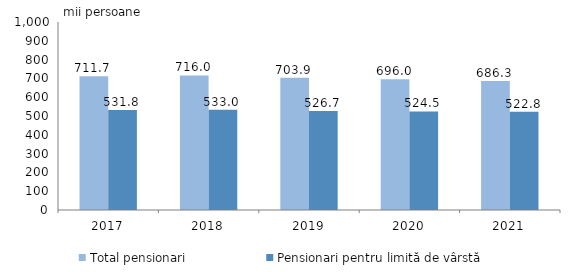
| Category | Total pensionari | Pensionari pentru limită de vârstă |
|---|---|---|
| 2017.0 | 711.7 | 531.8 |
| 2018.0 | 716 | 533 |
| 2019.0 | 703.9 | 526.7 |
| 2020.0 | 696 | 524.5 |
| 2021.0 | 686.3 | 522.8 |